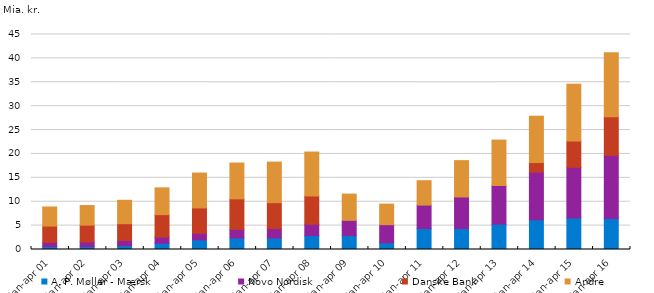
| Category | A. P. Møller - Mærsk | Novo Nordisk | Danske Bank | Andre |
|---|---|---|---|---|
| jan-apr 01 | 0.6 | 0.9 | 3.4 | 4 |
| jan-apr 02 | 0.6 | 1 | 3.5 | 4.1 |
| jan-apr 03 | 0.8 | 1.1 | 3.5 | 4.9 |
| jan-apr 04 | 1.3 | 1.3 | 4.7 | 5.6 |
| jan-apr 05 | 2 | 1.4 | 5.3 | 7.3 |
| jan-apr 06 | 2.4 | 1.8 | 6.4 | 7.5 |
| jan-apr 07 | 2.4 | 2 | 5.4 | 8.5 |
| jan-apr 08 | 2.9 | 2.4 | 5.9 | 9.2 |
| jan-apr 09 | 2.9 | 3.2 | 0 | 5.5 |
| jan-apr 10 | 1.4 | 3.8 | 0 | 4.3 |
| jan-apr 11 | 4.4 | 4.9 | 0 | 5.1 |
| jan-apr 12 | 4.4 | 6.6 | 0 | 7.6 |
| jan-apr 13 | 5.3 | 8.1 | 0 | 9.5 |
| jan-apr 14 | 6.2 | 10 | 2 | 9.7 |
| jan-apr 15 | 6.6 | 10.6 | 5.5 | 11.9 |
| jan-apr 16 | 6.5 | 13.2 | 8.1 | 13.4 |